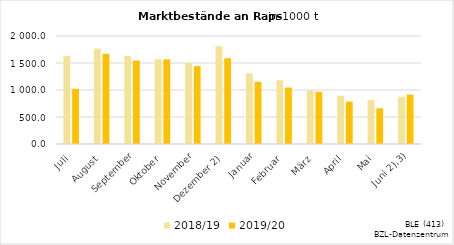
| Category | 2018/19 | 2019/20 |
|---|---|---|
| Juli | 1631.812 | 1022.43 |
| August | 1766.068 | 1670.48 |
| September | 1632.437 | 1546.896 |
| Oktober | 1568.802 | 1568.403 |
| November | 1498.964 | 1441.768 |
|  Dezember 2) | 1810.702 | 1588.226 |
| Januar | 1307.727 | 1150.217 |
| Februar | 1180.786 | 1045.611 |
| März | 991.1 | 967.689 |
| April | 894.07 | 785.799 |
| Mai | 812.594 | 662.389 |
|    Juni 2),3) | 875.947 | 916.112 |